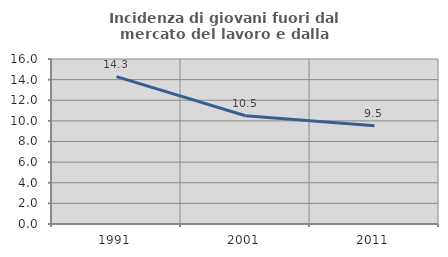
| Category | Incidenza di giovani fuori dal mercato del lavoro e dalla formazione  |
|---|---|
| 1991.0 | 14.286 |
| 2001.0 | 10.502 |
| 2011.0 | 9.524 |